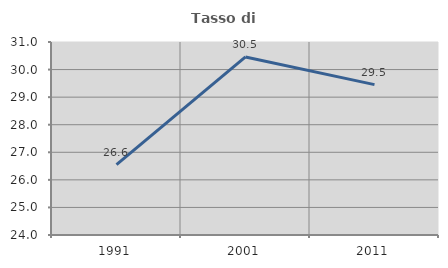
| Category | Tasso di occupazione   |
|---|---|
| 1991.0 | 26.551 |
| 2001.0 | 30.459 |
| 2011.0 | 29.454 |